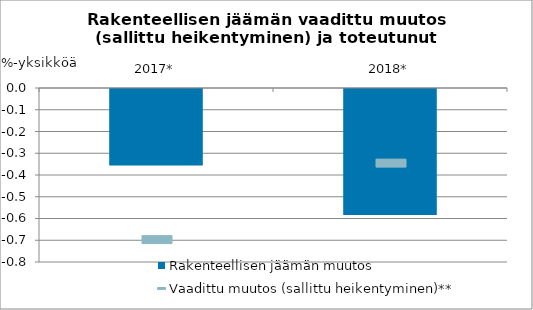
| Category | Rakenteellisen jäämän muutos |
|---|---|
| 2017* | -0.352 |
| 2018* | -0.579 |